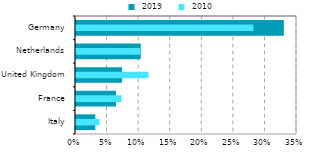
| Category |  2019 |
|---|---|
| Italy | 0.031 |
| France | 0.063 |
| United Kingdom | 0.073 |
| Netherlands | 0.103 |
| Germany | 0.329 |